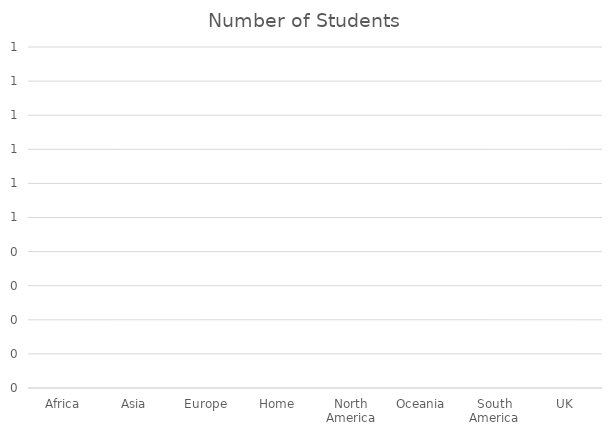
| Category | Number of Students |
|---|---|
| Africa | 0 |
| Asia | 0 |
| Europe | 0 |
| Home | 0 |
| North America | 0 |
| Oceania | 0 |
| South America | 0 |
| UK | 0 |